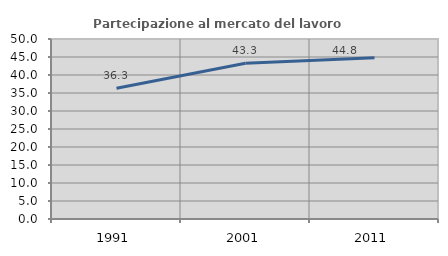
| Category | Partecipazione al mercato del lavoro  femminile |
|---|---|
| 1991.0 | 36.347 |
| 2001.0 | 43.257 |
| 2011.0 | 44.767 |